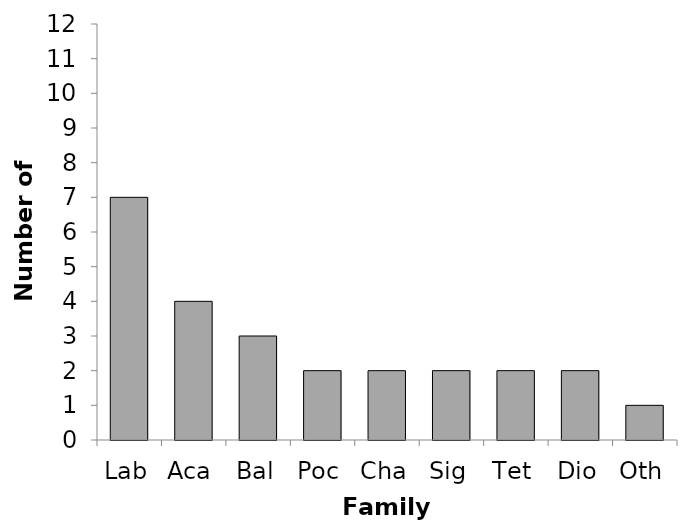
| Category | Series 0 |
|---|---|
| Lab | 7 |
| Aca | 4 |
| Bal | 3 |
| Poc | 2 |
| Cha | 2 |
| Sig | 2 |
| Tet | 2 |
| Dio | 2 |
| Oth | 1 |